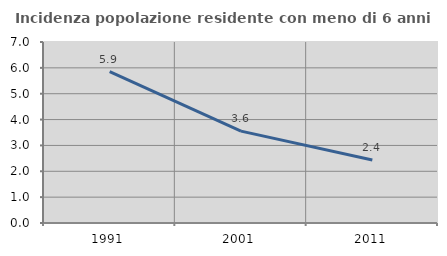
| Category | Incidenza popolazione residente con meno di 6 anni |
|---|---|
| 1991.0 | 5.852 |
| 2001.0 | 3.552 |
| 2011.0 | 2.434 |